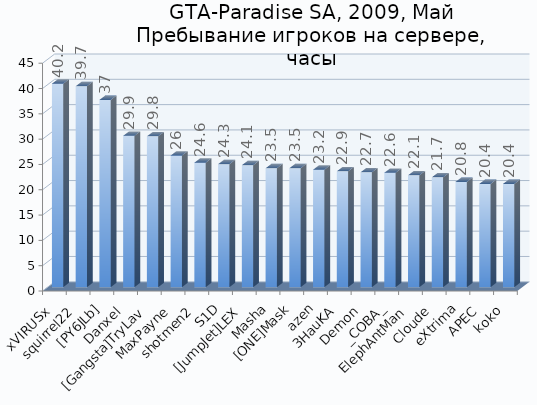
| Category | Series 0 |
|---|---|
| xVIRUSx | 40.2 |
| squirrel22 | 39.7 |
| [PY6JLb] | 37 |
| Danxel | 29.9 |
| [Gangsta]TryLav | 29.8 |
| MaxPayne | 26 |
| shotmen2 | 24.6 |
| S1D | 24.3 |
| [JumpJet]LEX | 24.1 |
| Masha | 23.5 |
| [ONE]Mask | 23.5 |
| azen | 23.2 |
| 3HauKA | 22.9 |
| Demon | 22.7 |
| _COBA_ | 22.6 |
| ElephAntMan | 22.1 |
| Cloude | 21.7 |
| eXtrima | 20.8 |
| APEC | 20.4 |
| koko | 20.4 |